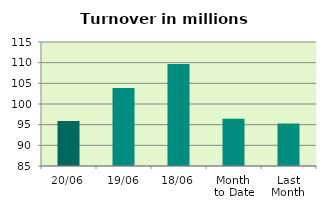
| Category | Series 0 |
|---|---|
| 20/06 | 95.901 |
| 19/06 | 103.857 |
| 18/06 | 109.69 |
| Month 
to Date | 96.424 |
| Last
Month | 95.269 |